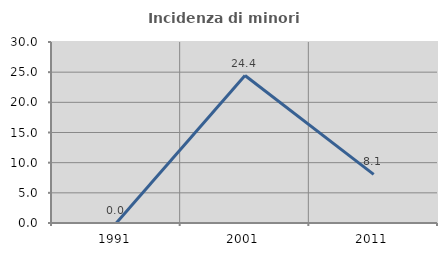
| Category | Incidenza di minori stranieri |
|---|---|
| 1991.0 | 0 |
| 2001.0 | 24.444 |
| 2011.0 | 8.065 |